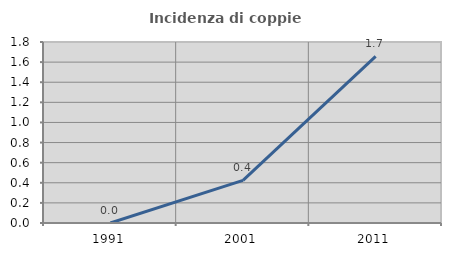
| Category | Incidenza di coppie miste |
|---|---|
| 1991.0 | 0 |
| 2001.0 | 0.424 |
| 2011.0 | 1.657 |